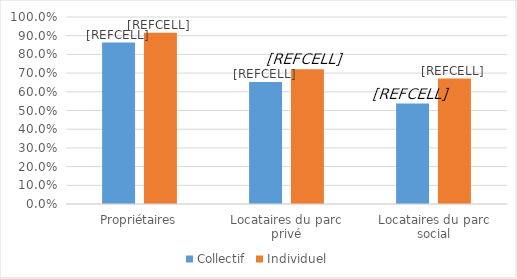
| Category | Collectif | Individuel |
|---|---|---|
| Propriétaires | 0.864 | 0.915 |
| Locataires du parc privé | 0.653 | 0.72 |
| Locataires du parc social | 0.537 | 0.671 |